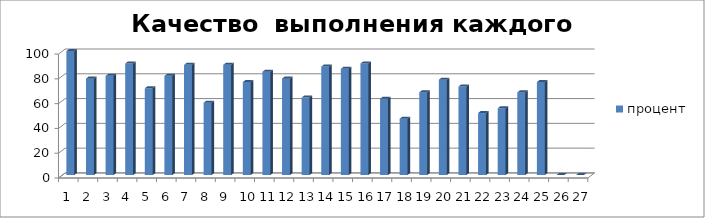
| Category | процент |
|---|---|
| 0 | 100 |
| 1 | 77.778 |
| 2 | 80 |
| 3 | 90 |
| 4 | 70 |
| 5 | 80 |
| 6 | 88.889 |
| 7 | 58.333 |
| 8 | 88.889 |
| 9 | 75 |
| 10 | 83.333 |
| 11 | 77.778 |
| 12 | 62.5 |
| 13 | 87.5 |
| 14 | 85.714 |
| 15 | 90 |
| 16 | 61.538 |
| 17 | 45.455 |
| 18 | 66.667 |
| 19 | 76.923 |
| 20 | 71.429 |
| 21 | 50 |
| 22 | 53.846 |
| 23 | 66.667 |
| 24 | 75 |
| 25 | 0 |
| 26 | 0 |